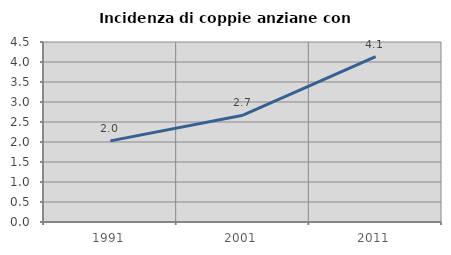
| Category | Incidenza di coppie anziane con figli |
|---|---|
| 1991.0 | 2.028 |
| 2001.0 | 2.67 |
| 2011.0 | 4.132 |